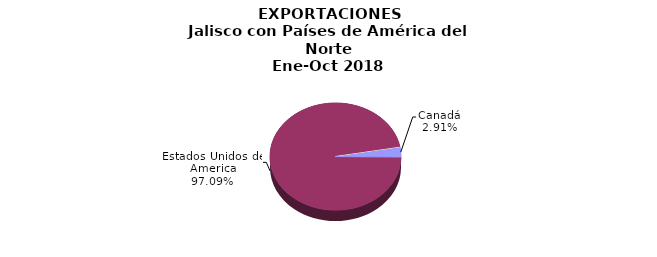
| Category | EXPORTACIONES |
|---|---|
| Canadá | 875.991 |
| Estados Unidos de America | 29240.12 |
| Otros | 0 |